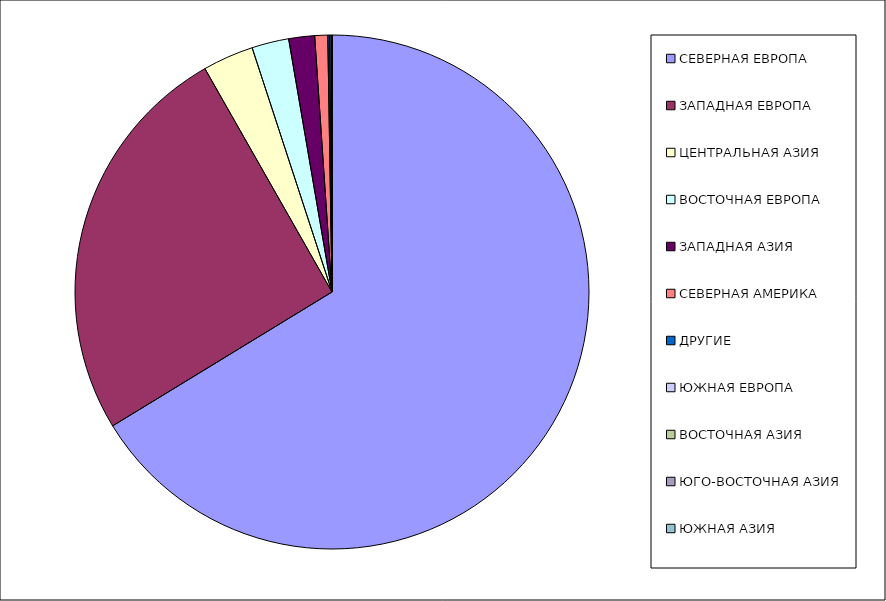
| Category | Оборот |
|---|---|
| СЕВЕРНАЯ ЕВРОПА | 66.277 |
| ЗАПАДНАЯ ЕВРОПА | 25.49 |
| ЦЕНТРАЛЬНАЯ АЗИЯ | 3.203 |
| ВОСТОЧНАЯ ЕВРОПА | 2.329 |
| ЗАПАДНАЯ АЗИЯ | 1.626 |
| СЕВЕРНАЯ АМЕРИКА | 0.813 |
| ДРУГИЕ | 0.116 |
| ЮЖНАЯ ЕВРОПА | 0.087 |
| ВОСТОЧНАЯ АЗИЯ | 0.056 |
| ЮГО-ВОСТОЧНАЯ АЗИЯ | 0.002 |
| ЮЖНАЯ АЗИЯ | 0.001 |